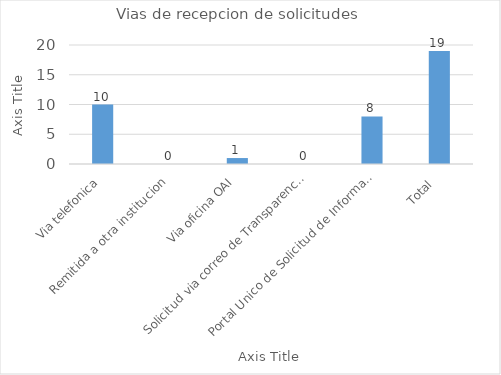
| Category | Series 0 |
|---|---|
| Via telefonica | 10 |
| Remitida a otra institucion | 0 |
| Via oficina OAI | 1 |
| Solicitud via correo de Transparencia  | 0 |
| Portal Unico de Solicitud de Informacion Pública-SAIP | 8 |
| Total  | 19 |